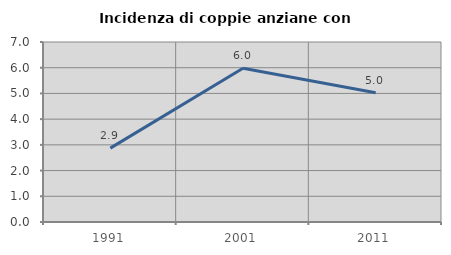
| Category | Incidenza di coppie anziane con figli |
|---|---|
| 1991.0 | 2.874 |
| 2001.0 | 5.976 |
| 2011.0 | 5.025 |